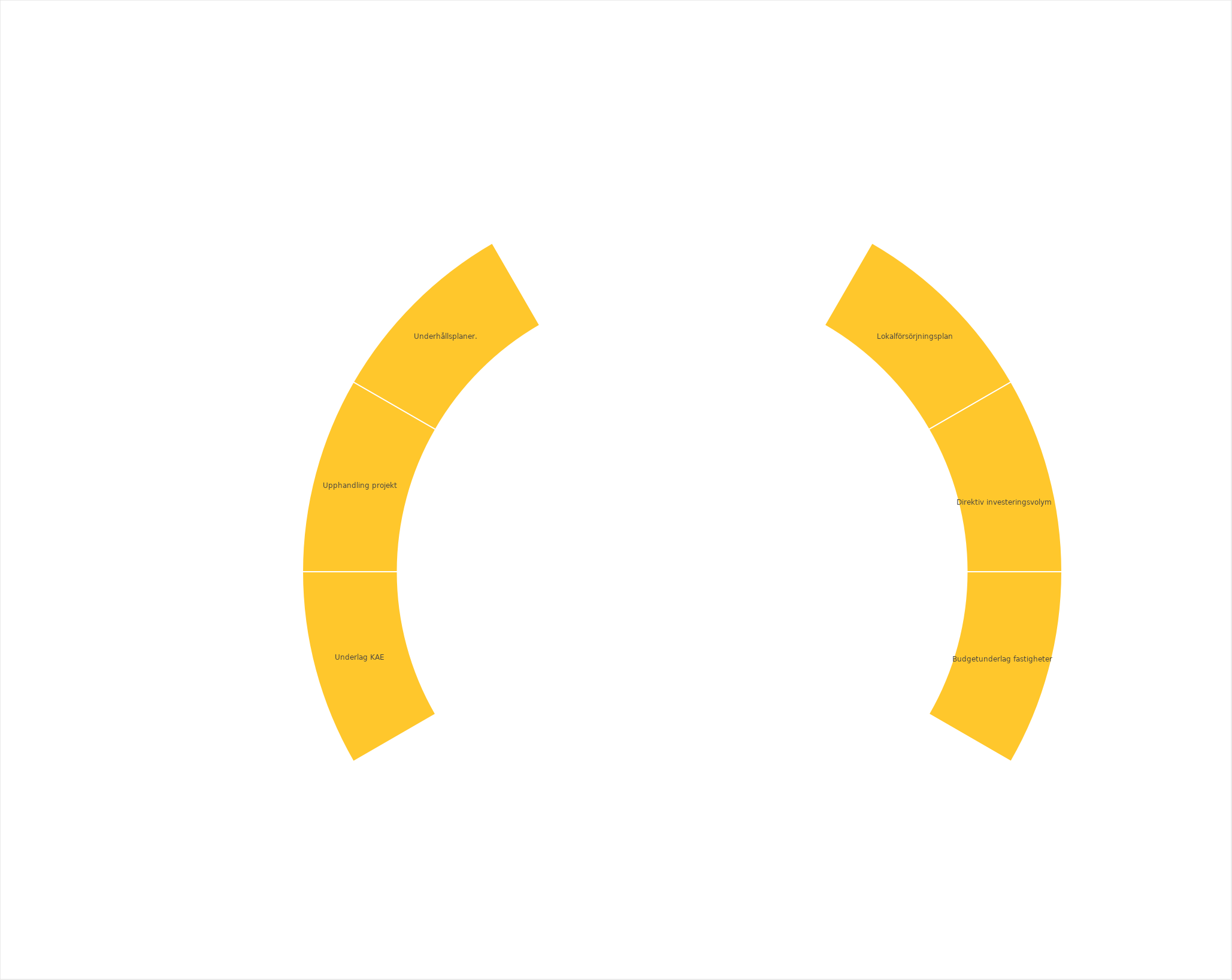
| Category | 1 |
|---|---|
|  | 1 |
| Lokalförsörjningsplan | 1 |
| Direktiv investeringsvolym | 1 |
| Budgetunderlag fastigheter | 1 |
|  | 1 |
|  | 1 |
|  | 1 |
|  | 1 |
| Underlag KAE | 1 |
| Upphandling projekt | 1 |
| Underhållsplaner. | 1 |